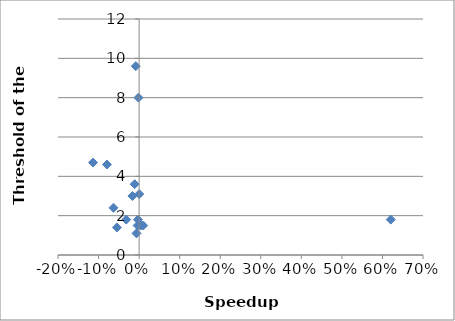
| Category | Threshold of the factor (If resultcache_cost_factor is more than this value, the planner does not use Result Cache.) |
|---|---|
| 0.000296376941339437 | 3.1 |
| -0.0082467214488664 | 9.6 |
| -0.0164943743089065 | 3 |
| -0.00162475523956384 | 8 |
| 0.0101880910299622 | 1.5 |
| -0.0109629017091692 | 3.6 |
| -0.0631572097754007 | 2.4 |
| -0.0548191928215564 | 1.4 |
| 0.620551432750121 | 1.8 |
| -0.113599735565221 | 4.7 |
| -0.0316554704744669 | 1.8 |
| -0.00646237454808829 | 1.1 |
| -0.00286608090948292 | 1.8 |
| 0.00400002775231378 | 1.5 |
| -0.0793055080504203 | 4.6 |
| -0.00374206019660561 | 1.5 |